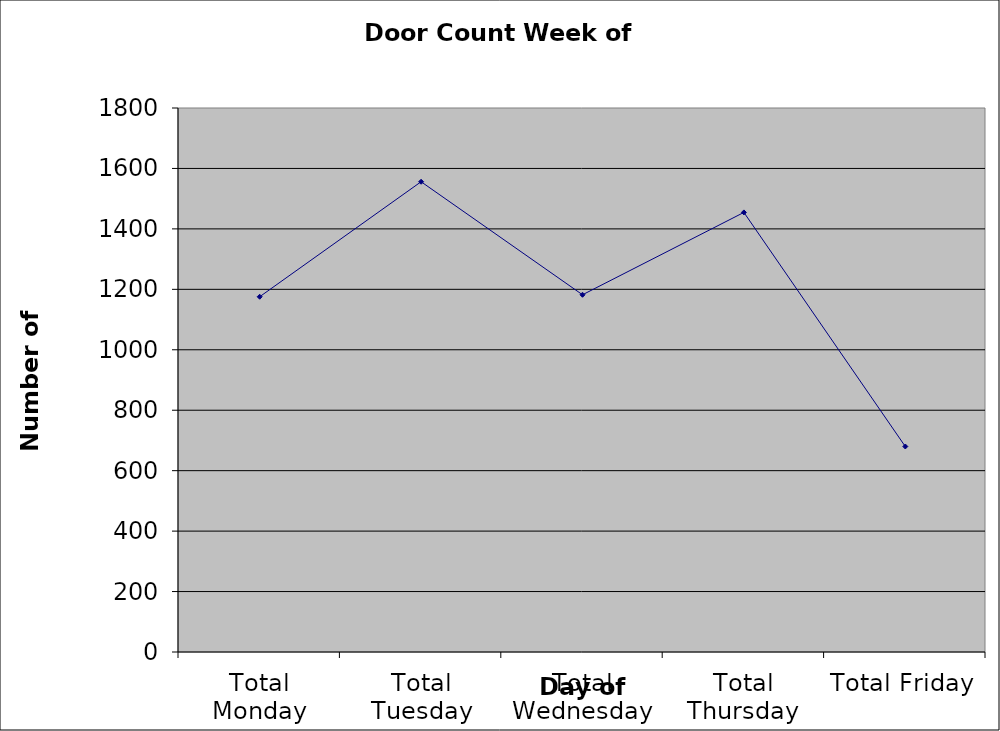
| Category | Series 0 |
|---|---|
| Total Monday | 1175.5 |
| Total Tuesday | 1556 |
| Total Wednesday | 1182 |
| Total Thursday | 1454.5 |
| Total Friday | 680 |